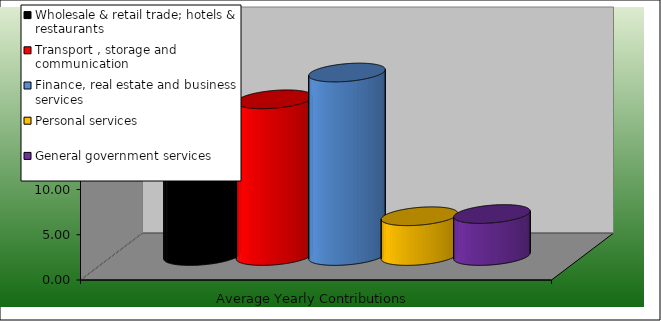
| Category | Wholesale & retail trade; hotels & restaurants | Transport , storage and communication | Finance, real estate and business services | Personal services | General government services |
|---|---|---|---|---|---|
| Average Yearly Contributions | 15.952 | 17.323 | 20.285 | 4.394 | 4.641 |